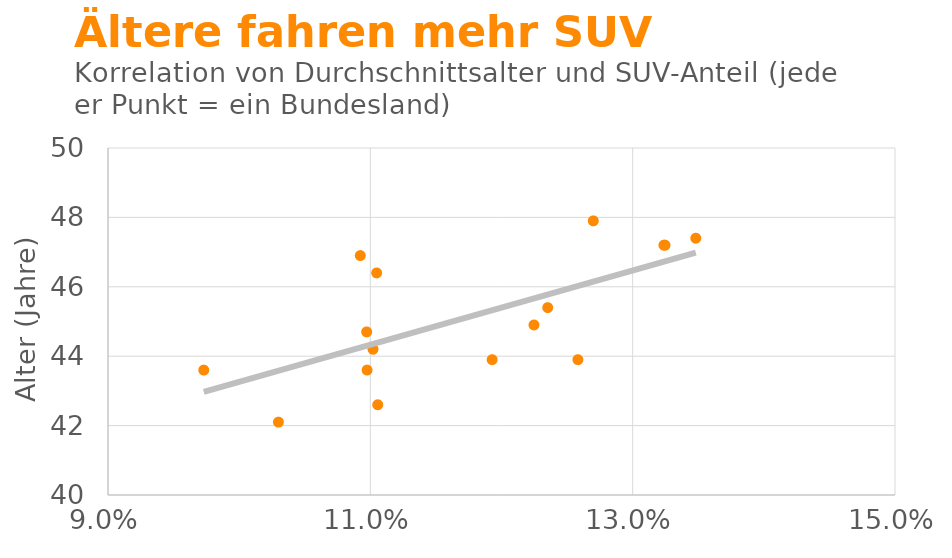
| Category | Series 0 |
|---|---|
| 0.1105653912050257 | 42.6 |
| 0.10299234516353514 | 42.1 |
| 0.0973017170891251 | 43.6 |
| 0.11020379011522712 | 44.2 |
| 0.11048281861678991 | 46.4 |
| 0.10975314030748339 | 43.6 |
| 0.1192846849207389 | 43.9 |
| 0.10923217550274222 | 46.9 |
| 0.12247669050420928 | 44.9 |
| 0.1258257678192003 | 43.9 |
| 0.12352420306965761 | 45.4 |
| 0.109720885466795 | 44.7 |
| 0.13481345845731288 | 47.4 |
| 0.12699802934092402 | 47.9 |
| 0.13238053991626966 | 47.2 |
| 0.1324667285670071 | 47.2 |